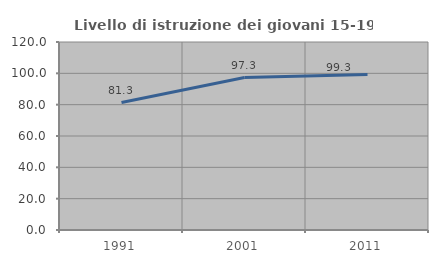
| Category | Livello di istruzione dei giovani 15-19 anni |
|---|---|
| 1991.0 | 81.328 |
| 2001.0 | 97.326 |
| 2011.0 | 99.291 |